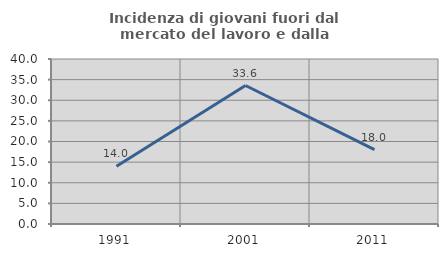
| Category | Incidenza di giovani fuori dal mercato del lavoro e dalla formazione  |
|---|---|
| 1991.0 | 14 |
| 2001.0 | 33.575 |
| 2011.0 | 18.012 |